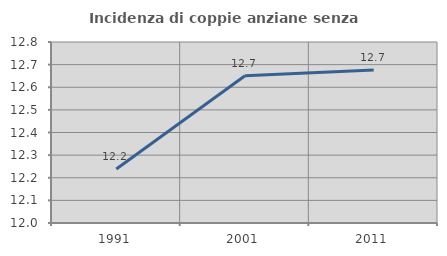
| Category | Incidenza di coppie anziane senza figli  |
|---|---|
| 1991.0 | 12.238 |
| 2001.0 | 12.651 |
| 2011.0 | 12.676 |